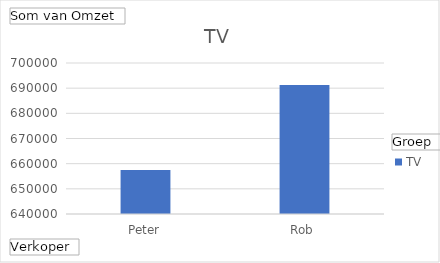
| Category | TV |
|---|---|
| Peter | 657500 |
| Rob | 691250 |